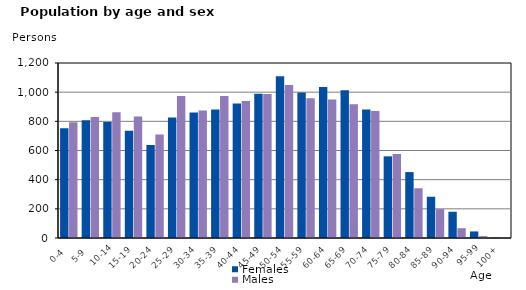
| Category | Females | Males |
|---|---|---|
|   0-4  | 753 | 793 |
|   5-9  | 807 | 830 |
| 10-14 | 796 | 863 |
| 15-19  | 736 | 833 |
| 20-24  | 637 | 709 |
| 25-29  | 826 | 974 |
| 30-34  | 860 | 874 |
| 35-39  | 882 | 974 |
| 40-44  | 923 | 940 |
| 45-49  | 989 | 988 |
| 50-54  | 1110 | 1050 |
| 55-59  | 998 | 959 |
| 60-64  | 1035 | 949 |
| 65-69  | 1014 | 917 |
| 70-74  | 881 | 871 |
| 75-79  | 560 | 576 |
| 80-84  | 452 | 341 |
| 85-89  | 283 | 198 |
| 90-94  | 180 | 67 |
| 95-99 | 45 | 13 |
| 100+ | 2 | 1 |